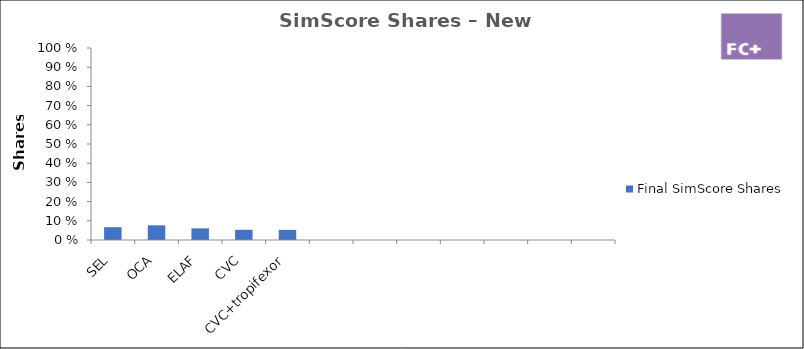
| Category | Final SimScore Shares |
|---|---|
| SEL | 0.067 |
| OCA | 0.076 |
| ELAF | 0.061 |
| CVC | 0.053 |
| CVC+tropifexor | 0.053 |